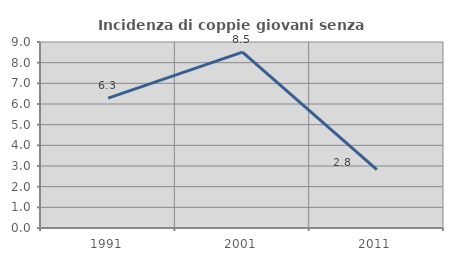
| Category | Incidenza di coppie giovani senza figli |
|---|---|
| 1991.0 | 6.286 |
| 2001.0 | 8.511 |
| 2011.0 | 2.825 |